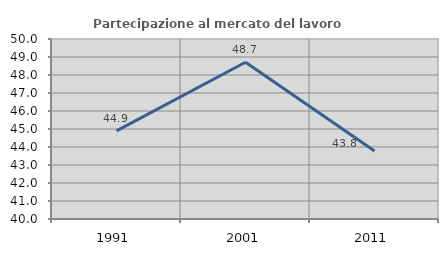
| Category | Partecipazione al mercato del lavoro  femminile |
|---|---|
| 1991.0 | 44.894 |
| 2001.0 | 48.707 |
| 2011.0 | 43.783 |